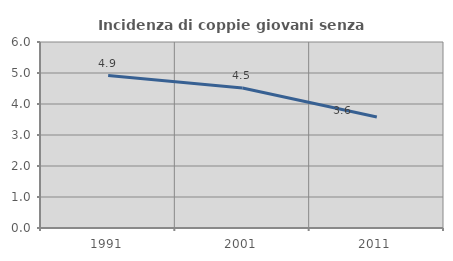
| Category | Incidenza di coppie giovani senza figli |
|---|---|
| 1991.0 | 4.919 |
| 2001.0 | 4.517 |
| 2011.0 | 3.579 |